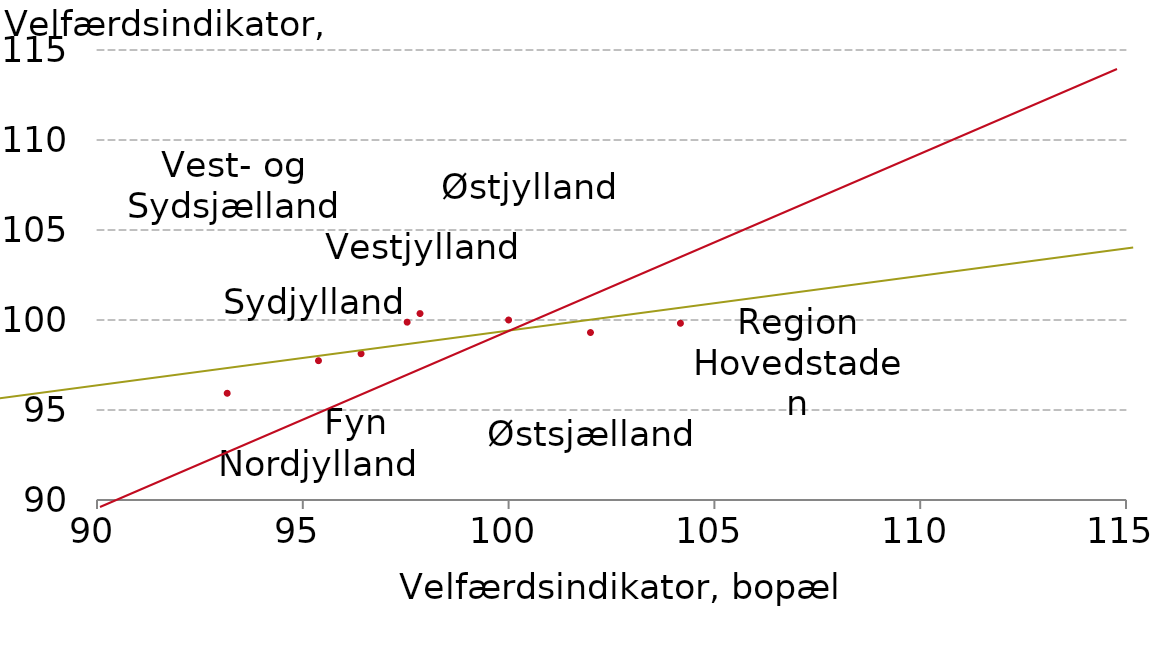
| Category |  Serie1 |
|---|---|
| 96.416 | 98.126 |
| 104.175 | 99.818 |
| 95.381 | 97.74 |
| 97.535 | 99.879 |
| 93.163 | 95.929 |
| 97.848 | 100.357 |
| 100.0 | 100 |
| 101.989 | 99.303 |